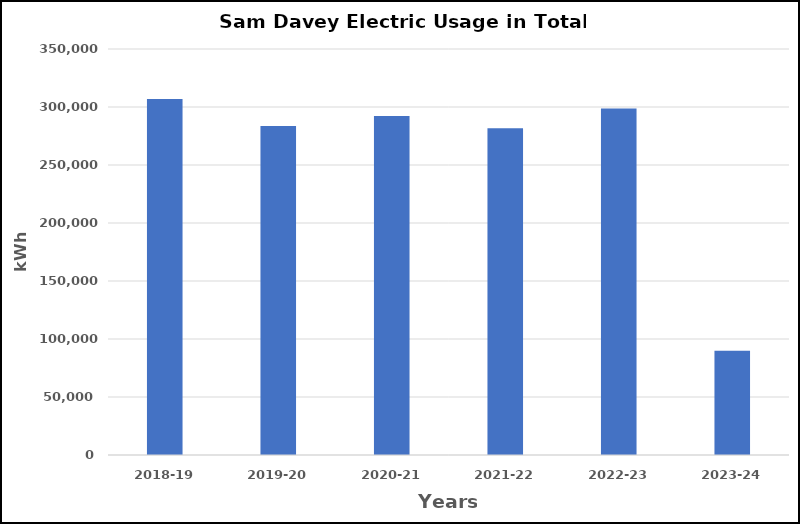
| Category | Series 0 |
|---|---|
| 2018-19 | 306890 |
| 2019-20 | 283554 |
| 2020-21 | 292330 |
| 2021-22 | 281696 |
| 2022-23 | 298761 |
| 2023-24 | 89773 |